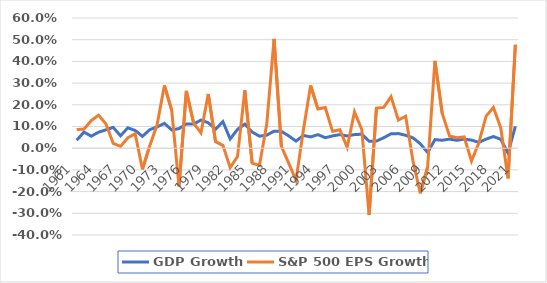
| Category | GDP Growth | S&P 500 EPS Growth |
|---|---|---|
| 1961.0 | 0.037 | 0.086 |
| 1962.0 | 0.074 | 0.088 |
| 1963.0 | 0.056 | 0.128 |
| 1964.0 | 0.074 | 0.152 |
| 1965.0 | 0.084 | 0.112 |
| 1966.0 | 0.096 | 0.022 |
| 1967.0 | 0.057 | 0.008 |
| 1968.0 | 0.094 | 0.048 |
| 1969.0 | 0.082 | 0.067 |
| 1970.0 | 0.055 | -0.097 |
| 1971.0 | 0.085 | 0.012 |
| 1972.0 | 0.098 | 0.108 |
| 1973.0 | 0.114 | 0.289 |
| 1974.0 | 0.084 | 0.175 |
| 1975.0 | 0.09 | -0.175 |
| 1976.0 | 0.112 | 0.264 |
| 1977.0 | 0.111 | 0.115 |
| 1978.0 | 0.13 | 0.071 |
| 1979.0 | 0.117 | 0.25 |
| 1980.0 | 0.088 | 0.03 |
| 1981.0 | 0.122 | 0.013 |
| 1982.0 | 0.043 | -0.09 |
| 1983.0 | 0.087 | -0.038 |
| 1984.0 | 0.111 | 0.267 |
| 1985.0 | 0.075 | -0.069 |
| 1986.0 | 0.055 | -0.079 |
| 1987.0 | 0.06 | 0.111 |
| 1988.0 | 0.079 | 0.504 |
| 1989.0 | 0.077 | 0.008 |
| 1990.0 | 0.057 | -0.069 |
| 1991.0 | 0.033 | -0.148 |
| 1992.0 | 0.059 | 0.081 |
| 1993.0 | 0.052 | 0.289 |
| 1994.0 | 0.063 | 0.18 |
| 1995.0 | 0.048 | 0.187 |
| 1996.0 | 0.057 | 0.078 |
| 1997.0 | 0.062 | 0.085 |
| 1998.0 | 0.057 | 0.004 |
| 1999.0 | 0.063 | 0.167 |
| 2000.0 | 0.064 | 0.086 |
| 2001.0 | 0.032 | -0.308 |
| 2002.0 | 0.033 | 0.185 |
| 2003.0 | 0.048 | 0.188 |
| 2004.0 | 0.066 | 0.238 |
| 2005.0 | 0.067 | 0.13 |
| 2006.0 | 0.06 | 0.147 |
| 2007.0 | 0.048 | -0.059 |
| 2008.0 | 0.02 | -0.208 |
| 2009.0 | -0.02 | -0.088 |
| 2010.0 | 0.039 | 0.403 |
| 2011.0 | 0.037 | 0.16 |
| 2012.0 | 0.042 | 0.056 |
| 2013.0 | 0.036 | 0.049 |
| 2014.0 | 0.042 | 0.052 |
| 2015.0 | 0.037 | -0.059 |
| 2016.0 | 0.027 | 0.024 |
| 2017.0 | 0.042 | 0.148 |
| 2018.0 | 0.054 | 0.187 |
| 2019.0 | 0.041 | 0.094 |
| 2020.0 | -0.022 | -0.139 |
| 2021.0 | 0.101 | 0.477 |